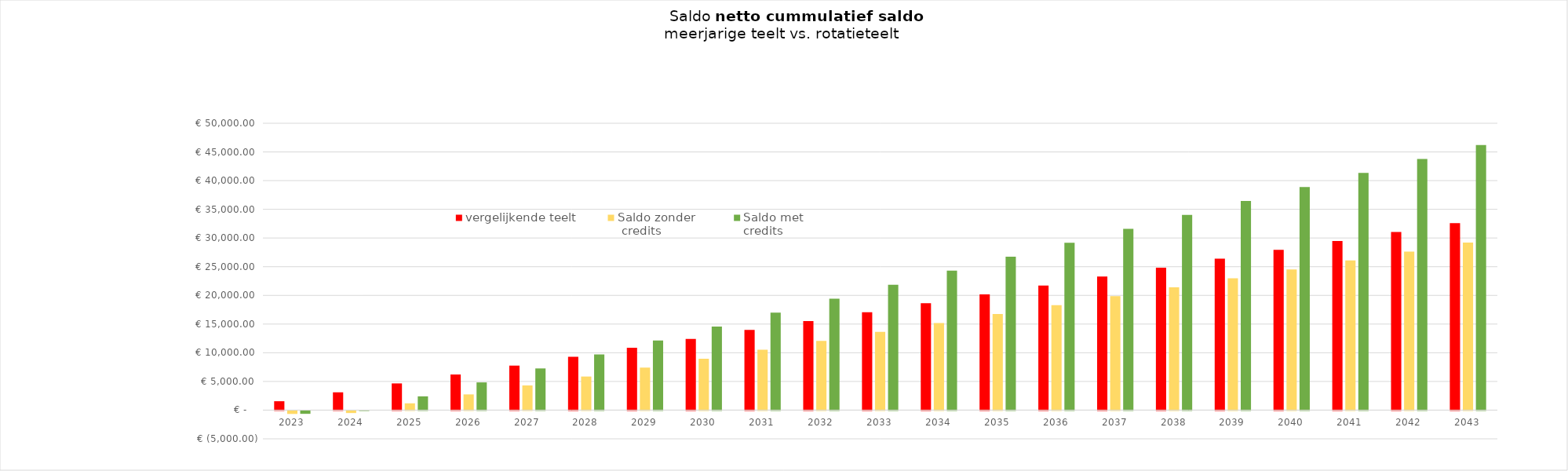
| Category | vergelijkende teelt | Saldo zonder
 credits | Saldo met 
credits  |
|---|---|---|---|
| 2023.0 | 1552 | -526 | -506.4 |
| 2024.0 | 3104 | -369.5 | -7.95 |
| 2025.0 | 4656 | 1187 | 2400.8 |
| 2026.0 | 6208 | 2743.5 | 4834.05 |
| 2027.0 | 7760 | 4300 | 7267.3 |
| 2028.0 | 9312 | 5856.5 | 9700.55 |
| 2029.0 | 10864 | 7413 | 12133.8 |
| 2030.0 | 12416 | 8969.5 | 14567.05 |
| 2031.0 | 13968 | 10526 | 17000.3 |
| 2032.0 | 15520 | 12082.5 | 19433.55 |
| 2033.0 | 17072 | 13639 | 21866.8 |
| 2034.0 | 18624 | 15195.5 | 24300.05 |
| 2035.0 | 20176 | 16752 | 26733.3 |
| 2036.0 | 21728 | 18308.5 | 29166.55 |
| 2037.0 | 23280 | 19865 | 31599.8 |
| 2038.0 | 24832 | 21421.5 | 34033.05 |
| 2039.0 | 26384 | 22978 | 36466.3 |
| 2040.0 | 27936 | 24534.5 | 38899.55 |
| 2041.0 | 29488 | 26091 | 41332.8 |
| 2042.0 | 31040 | 27647.5 | 43766.05 |
| 2043.0 | 32592 | 29204 | 46199.3 |